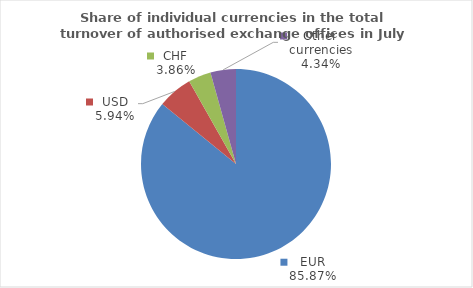
| Category | Series 0 |
|---|---|
| EUR | 85.867 |
| USD | 5.939 |
| CHF | 3.86 |
| Other currencies | 4.335 |